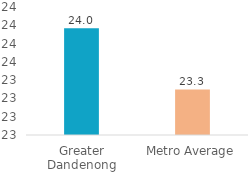
| Category | Series 0 |
|---|---|
| Greater Dandenong | 23.967 |
| Metro Average | 23.299 |